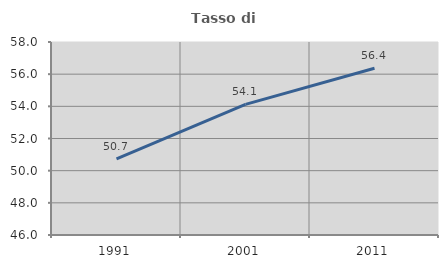
| Category | Tasso di occupazione   |
|---|---|
| 1991.0 | 50.739 |
| 2001.0 | 54.121 |
| 2011.0 | 56.371 |